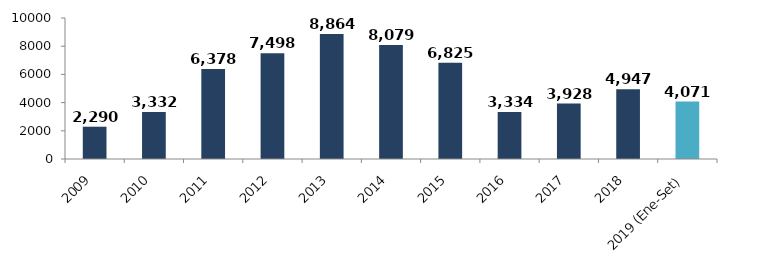
| Category | Series 0 |
|---|---|
| 2009 | 2290.273 |
| 2010 | 3331.554 |
| 2011 | 6377.615 |
| 2012 | 7498.207 |
| 2013 | 8863.622 |
| 2014 | 8079.21 |
| 2015 | 6824.624 |
| 2016 | 3333.564 |
| 2017 | 3928.017 |
| 2018 | 4947.435 |
| 2019 (Ene-Set) | 4070.569 |